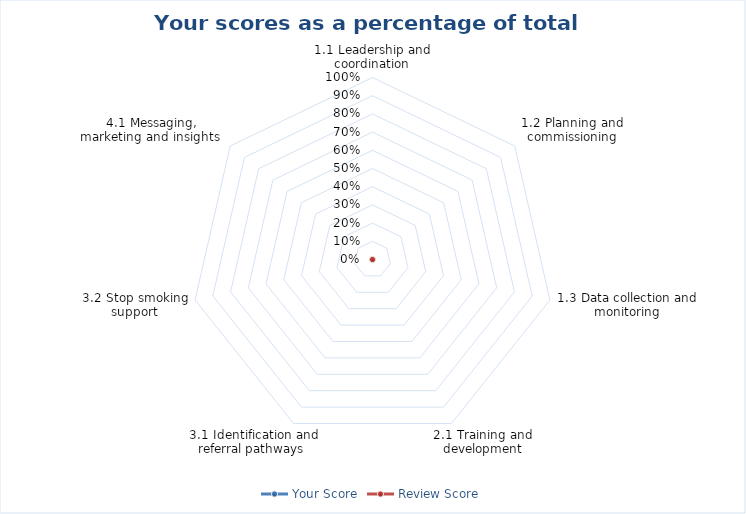
| Category | Your Score | Review Score |
|---|---|---|
| 1.1 Leadership and coordination | 0 | 0 |
| 1.2 Planning and commissioning | 0 | 0 |
| 1.3 Data collection and monitoring | 0 | 0 |
| 2.1 Training and development | 0 | 0 |
| 3.1 Identification and referral pathways  | 0 | 0 |
| 3.2 Stop smoking support | 0 | 0 |
| 4.1 Messaging, marketing and insights  | 0 | 0 |